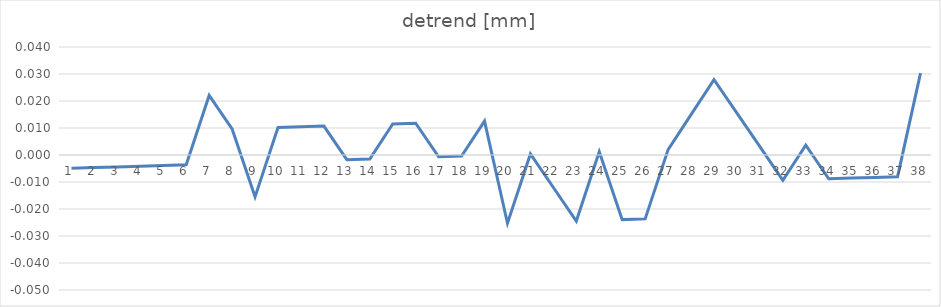
| Category | detrend [mm] |
|---|---|
| 0 | -0.005 |
| 1 | -0.005 |
| 2 | -0.004 |
| 3 | -0.004 |
| 4 | -0.004 |
| 5 | -0.004 |
| 6 | 0.022 |
| 7 | 0.01 |
| 8 | -0.016 |
| 9 | 0.01 |
| 10 | 0.01 |
| 11 | 0.011 |
| 12 | -0.002 |
| 13 | -0.001 |
| 14 | 0.011 |
| 15 | 0.012 |
| 16 | -0.001 |
| 17 | 0 |
| 18 | 0.013 |
| 19 | -0.025 |
| 20 | 0 |
| 21 | -0.012 |
| 22 | -0.024 |
| 23 | 0.001 |
| 24 | -0.024 |
| 25 | -0.024 |
| 26 | 0.002 |
| 27 | 0.015 |
| 28 | 0.028 |
| 29 | 0.016 |
| 30 | 0.003 |
| 31 | -0.009 |
| 32 | 0.004 |
| 33 | -0.009 |
| 34 | -0.009 |
| 35 | -0.008 |
| 36 | -0.008 |
| 37 | 0.03 |